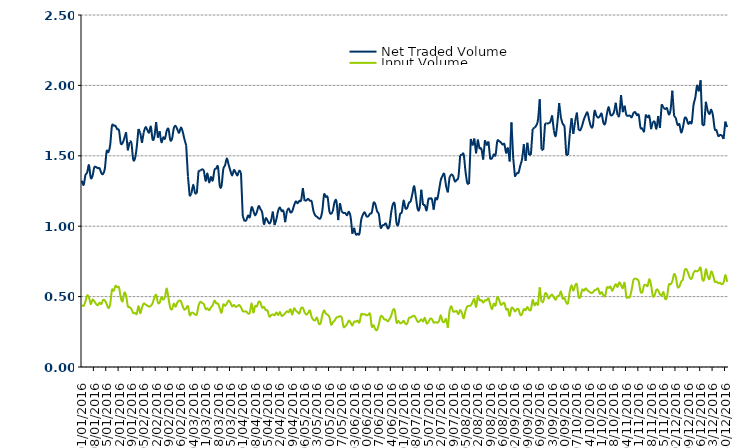
| Category | Net Traded Volume | Input Volume |
|---|---|---|
| 01/01/2016 | 1.323 | 0.439 |
| 02/01/2016 | 1.293 | 0.434 |
| 03/01/2016 | 1.362 | 0.464 |
| 04/01/2016 | 1.381 | 0.508 |
| 05/01/2016 | 1.434 | 0.495 |
| 06/01/2016 | 1.344 | 0.447 |
| 07/01/2016 | 1.357 | 0.478 |
| 08/01/2016 | 1.417 | 0.467 |
| 09/01/2016 | 1.42 | 0.449 |
| 10/01/2016 | 1.412 | 0.438 |
| 11/01/2016 | 1.411 | 0.457 |
| 12/01/2016 | 1.378 | 0.447 |
| 13/01/2016 | 1.371 | 0.476 |
| 14/01/2016 | 1.41 | 0.472 |
| 15/01/2016 | 1.531 | 0.449 |
| 16/01/2016 | 1.526 | 0.418 |
| 17/01/2016 | 1.576 | 0.447 |
| 18/01/2016 | 1.712 | 0.546 |
| 19/01/2016 | 1.714 | 0.541 |
| 20/01/2016 | 1.712 | 0.576 |
| 21/01/2016 | 1.689 | 0.566 |
| 22/01/2016 | 1.68 | 0.565 |
| 23/01/2016 | 1.589 | 0.493 |
| 24/01/2016 | 1.59 | 0.466 |
| 25/01/2016 | 1.624 | 0.528 |
| 26/01/2016 | 1.668 | 0.506 |
| 27/01/2016 | 1.539 | 0.432 |
| 28/01/2016 | 1.598 | 0.425 |
| 29/01/2016 | 1.593 | 0.411 |
| 30/01/2016 | 1.477 | 0.384 |
| 31/01/2016 | 1.479 | 0.384 |
| 01/02/2016 | 1.559 | 0.377 |
| 02/02/2016 | 1.691 | 0.433 |
| 03/02/2016 | 1.664 | 0.382 |
| 04/02/2016 | 1.592 | 0.423 |
| 05/02/2016 | 1.667 | 0.451 |
| 06/02/2016 | 1.703 | 0.444 |
| 07/02/2016 | 1.684 | 0.436 |
| 08/02/2016 | 1.664 | 0.429 |
| 09/02/2016 | 1.707 | 0.435 |
| 10/02/2016 | 1.616 | 0.453 |
| 11/02/2016 | 1.636 | 0.493 |
| 12/02/2016 | 1.739 | 0.512 |
| 13/02/2016 | 1.629 | 0.458 |
| 14/02/2016 | 1.674 | 0.457 |
| 15/02/2016 | 1.597 | 0.496 |
| 16/02/2016 | 1.631 | 0.478 |
| 17/02/2016 | 1.621 | 0.497 |
| 18/02/2016 | 1.678 | 0.558 |
| 19/02/2016 | 1.69 | 0.487 |
| 20/02/2016 | 1.613 | 0.421 |
| 21/02/2016 | 1.621 | 0.411 |
| 22/02/2016 | 1.695 | 0.45 |
| 23/02/2016 | 1.713 | 0.428 |
| 24/02/2016 | 1.688 | 0.458 |
| 25/02/2016 | 1.663 | 0.471 |
| 26/02/2016 | 1.701 | 0.467 |
| 27/02/2016 | 1.673 | 0.432 |
| 28/02/2016 | 1.618 | 0.407 |
| 29/02/2016 | 1.575 | 0.417 |
| 01/03/2016 | 1.353 | 0.432 |
| 02/03/2016 | 1.213 | 0.368 |
| 03/03/2016 | 1.233 | 0.386 |
| 04/03/2016 | 1.295 | 0.383 |
| 05/03/2016 | 1.236 | 0.374 |
| 06/03/2016 | 1.233 | 0.373 |
| 07/03/2016 | 1.394 | 0.436 |
| 08/03/2016 | 1.394 | 0.463 |
| 09/03/2016 | 1.404 | 0.455 |
| 10/03/2016 | 1.392 | 0.447 |
| 11/03/2016 | 1.322 | 0.411 |
| 12/03/2016 | 1.374 | 0.417 |
| 13/03/2016 | 1.311 | 0.402 |
| 14/03/2016 | 1.35 | 0.423 |
| 15/03/2016 | 1.324 | 0.439 |
| 16/03/2016 | 1.399 | 0.471 |
| 17/03/2016 | 1.411 | 0.453 |
| 18/03/2016 | 1.421 | 0.45 |
| 19/03/2016 | 1.287 | 0.418 |
| 20/03/2016 | 1.287 | 0.386 |
| 21/03/2016 | 1.406 | 0.444 |
| 22/03/2016 | 1.432 | 0.435 |
| 23/03/2016 | 1.481 | 0.45 |
| 24/03/2016 | 1.438 | 0.472 |
| 25/03/2016 | 1.395 | 0.457 |
| 26/03/2016 | 1.36 | 0.431 |
| 27/03/2016 | 1.399 | 0.441 |
| 28/03/2016 | 1.38 | 0.427 |
| 29/03/2016 | 1.361 | 0.432 |
| 30/03/2016 | 1.394 | 0.44 |
| 31/03/2016 | 1.38 | 0.424 |
| 01/04/2016 | 1.073 | 0.397 |
| 02/04/2016 | 1.035 | 0.394 |
| 03/04/2016 | 1.043 | 0.394 |
| 04/04/2016 | 1.076 | 0.38 |
| 05/04/2016 | 1.064 | 0.386 |
| 06/04/2016 | 1.135 | 0.454 |
| 07/04/2016 | 1.109 | 0.386 |
| 08/04/2016 | 1.077 | 0.432 |
| 09/04/2016 | 1.102 | 0.431 |
| 10/04/2016 | 1.143 | 0.463 |
| 11/04/2016 | 1.122 | 0.457 |
| 12/04/2016 | 1.097 | 0.421 |
| 13/04/2016 | 1.015 | 0.427 |
| 14/04/2016 | 1.057 | 0.404 |
| 15/04/2016 | 1.041 | 0.402 |
| 16/04/2016 | 1.019 | 0.359 |
| 17/04/2016 | 1.04 | 0.367 |
| 18/04/2016 | 1.104 | 0.374 |
| 19/04/2016 | 1.008 | 0.367 |
| 20/04/2016 | 1.048 | 0.388 |
| 21/04/2016 | 1.109 | 0.369 |
| 22/04/2016 | 1.133 | 0.391 |
| 23/04/2016 | 1.107 | 0.363 |
| 24/04/2016 | 1.109 | 0.369 |
| 25/04/2016 | 1.028 | 0.382 |
| 26/04/2016 | 1.109 | 0.396 |
| 27/04/2016 | 1.126 | 0.39 |
| 28/04/2016 | 1.098 | 0.411 |
| 29/04/2016 | 1.107 | 0.372 |
| 30/04/2016 | 1.146 | 0.416 |
| 01/05/2016 | 1.176 | 0.401 |
| 02/05/2016 | 1.163 | 0.39 |
| 03/05/2016 | 1.18 | 0.381 |
| 04/05/2016 | 1.184 | 0.417 |
| 05/05/2016 | 1.271 | 0.42 |
| 06/05/2016 | 1.18 | 0.389 |
| 07/05/2016 | 1.183 | 0.372 |
| 08/05/2016 | 1.194 | 0.383 |
| 09/05/2016 | 1.181 | 0.401 |
| 10/05/2016 | 1.175 | 0.354 |
| 11/05/2016 | 1.107 | 0.335 |
| 12/05/2016 | 1.077 | 0.332 |
| 13/05/2016 | 1.067 | 0.351 |
| 14/05/2016 | 1.056 | 0.308 |
| 15/05/2016 | 1.058 | 0.311 |
| 16/05/2016 | 1.109 | 0.368 |
| 17/05/2016 | 1.224 | 0.402 |
| 18/05/2016 | 1.208 | 0.379 |
| 19/05/2016 | 1.206 | 0.371 |
| 20/05/2016 | 1.107 | 0.355 |
| 21/05/2016 | 1.088 | 0.301 |
| 22/05/2016 | 1.112 | 0.318 |
| 23/05/2016 | 1.173 | 0.331 |
| 24/05/2016 | 1.176 | 0.351 |
| 25/05/2016 | 1.043 | 0.356 |
| 26/05/2016 | 1.163 | 0.36 |
| 27/05/2016 | 1.102 | 0.352 |
| 28/05/2016 | 1.094 | 0.286 |
| 29/05/2016 | 1.094 | 0.29 |
| 30/05/2016 | 1.077 | 0.304 |
| 31/05/2016 | 1.102 | 0.33 |
| 01/06/2016 | 1.066 | 0.315 |
| 02/06/2016 | 0.947 | 0.295 |
| 03/06/2016 | 0.988 | 0.322 |
| 04/06/2016 | 0.941 | 0.322 |
| 05/06/2016 | 0.946 | 0.329 |
| 06/06/2016 | 0.946 | 0.316 |
| 07/06/2016 | 1.044 | 0.374 |
| 08/06/2016 | 1.083 | 0.373 |
| 09/06/2016 | 1.099 | 0.375 |
| 10/06/2016 | 1.07 | 0.367 |
| 11/06/2016 | 1.071 | 0.371 |
| 12/06/2016 | 1.088 | 0.377 |
| 13/06/2016 | 1.097 | 0.288 |
| 14/06/2016 | 1.166 | 0.296 |
| 15/06/2016 | 1.155 | 0.269 |
| 16/06/2016 | 1.106 | 0.263 |
| 17/06/2016 | 1.084 | 0.304 |
| 18/06/2016 | 0.991 | 0.359 |
| 19/06/2016 | 1.005 | 0.358 |
| 20/06/2016 | 1.01 | 0.338 |
| 21/06/2016 | 1.019 | 0.337 |
| 22/06/2016 | 0.985 | 0.324 |
| 23/06/2016 | 1.005 | 0.34 |
| 24/06/2016 | 1.099 | 0.366 |
| 25/06/2016 | 1.158 | 0.405 |
| 26/06/2016 | 1.154 | 0.403 |
| 27/06/2016 | 1.022 | 0.316 |
| 28/06/2016 | 1.013 | 0.328 |
| 29/06/2016 | 1.086 | 0.311 |
| 30/06/2016 | 1.1 | 0.315 |
| 01/07/2016 | 1.182 | 0.328 |
| 02/07/2016 | 1.128 | 0.307 |
| 03/07/2016 | 1.13 | 0.309 |
| 04/07/2016 | 1.167 | 0.348 |
| 05/07/2016 | 1.177 | 0.352 |
| 06/07/2016 | 1.233 | 0.36 |
| 07/07/2016 | 1.284 | 0.364 |
| 08/07/2016 | 1.201 | 0.346 |
| 09/07/2016 | 1.12 | 0.321 |
| 10/07/2016 | 1.127 | 0.325 |
| 11/07/2016 | 1.259 | 0.339 |
| 12/07/2016 | 1.151 | 0.323 |
| 13/07/2016 | 1.149 | 0.349 |
| 14/07/2016 | 1.113 | 0.311 |
| 15/07/2016 | 1.19 | 0.318 |
| 16/07/2016 | 1.195 | 0.342 |
| 17/07/2016 | 1.192 | 0.34 |
| 18/07/2016 | 1.118 | 0.316 |
| 19/07/2016 | 1.205 | 0.319 |
| 20/07/2016 | 1.192 | 0.314 |
| 21/07/2016 | 1.254 | 0.326 |
| 22/07/2016 | 1.326 | 0.367 |
| 23/07/2016 | 1.357 | 0.324 |
| 24/07/2016 | 1.37 | 0.319 |
| 25/07/2016 | 1.287 | 0.34 |
| 26/07/2016 | 1.24 | 0.279 |
| 27/07/2016 | 1.348 | 0.405 |
| 28/07/2016 | 1.367 | 0.431 |
| 29/07/2016 | 1.357 | 0.395 |
| 30/07/2016 | 1.319 | 0.394 |
| 31/07/2016 | 1.329 | 0.398 |
| 01/08/2016 | 1.351 | 0.374 |
| 02/08/2016 | 1.504 | 0.405 |
| 03/08/2016 | 1.509 | 0.381 |
| 04/08/2016 | 1.508 | 0.346 |
| 05/08/2016 | 1.389 | 0.4 |
| 06/08/2016 | 1.308 | 0.43 |
| 07/08/2016 | 1.3 | 0.434 |
| 08/08/2016 | 1.62 | 0.437 |
| 09/08/2016 | 1.573 | 0.46 |
| 10/08/2016 | 1.623 | 0.483 |
| 11/08/2016 | 1.518 | 0.427 |
| 12/08/2016 | 1.615 | 0.504 |
| 13/08/2016 | 1.548 | 0.474 |
| 14/08/2016 | 1.549 | 0.475 |
| 15/08/2016 | 1.473 | 0.457 |
| 16/08/2016 | 1.611 | 0.474 |
| 17/08/2016 | 1.574 | 0.473 |
| 18/08/2016 | 1.602 | 0.488 |
| 19/08/2016 | 1.475 | 0.445 |
| 20/08/2016 | 1.483 | 0.41 |
| 21/08/2016 | 1.509 | 0.45 |
| 22/08/2016 | 1.506 | 0.436 |
| 23/08/2016 | 1.605 | 0.497 |
| 24/08/2016 | 1.604 | 0.478 |
| 25/08/2016 | 1.595 | 0.442 |
| 26/08/2016 | 1.58 | 0.449 |
| 27/08/2016 | 1.583 | 0.454 |
| 28/08/2016 | 1.521 | 0.409 |
| 29/08/2016 | 1.553 | 0.41 |
| 30/08/2016 | 1.46 | 0.362 |
| 31/08/2016 | 1.738 | 0.419 |
| 01/09/2016 | 1.483 | 0.414 |
| 02/09/2016 | 1.352 | 0.394 |
| 03/09/2016 | 1.379 | 0.41 |
| 04/09/2016 | 1.38 | 0.41 |
| 05/09/2016 | 1.431 | 0.37 |
| 06/09/2016 | 1.476 | 0.377 |
| 07/09/2016 | 1.582 | 0.411 |
| 08/09/2016 | 1.464 | 0.403 |
| 09/09/2016 | 1.592 | 0.427 |
| 10/09/2016 | 1.506 | 0.406 |
| 11/09/2016 | 1.508 | 0.408 |
| 12/09/2016 | 1.69 | 0.476 |
| 13/09/2016 | 1.7 | 0.438 |
| 14/09/2016 | 1.714 | 0.457 |
| 15/09/2016 | 1.754 | 0.437 |
| 16/09/2016 | 1.902 | 0.566 |
| 17/09/2016 | 1.544 | 0.461 |
| 18/09/2016 | 1.541 | 0.464 |
| 19/09/2016 | 1.729 | 0.522 |
| 20/09/2016 | 1.729 | 0.517 |
| 21/09/2016 | 1.731 | 0.487 |
| 22/09/2016 | 1.741 | 0.504 |
| 23/09/2016 | 1.787 | 0.514 |
| 24/09/2016 | 1.68 | 0.494 |
| 25/09/2016 | 1.64 | 0.478 |
| 26/09/2016 | 1.737 | 0.502 |
| 27/09/2016 | 1.874 | 0.507 |
| 28/09/2016 | 1.769 | 0.536 |
| 29/09/2016 | 1.728 | 0.486 |
| 30/09/2016 | 1.713 | 0.491 |
| 01/10/2016 | 1.506 | 0.457 |
| 02/10/2016 | 1.506 | 0.455 |
| 03/10/2016 | 1.657 | 0.538 |
| 04/10/2016 | 1.766 | 0.581 |
| 05/10/2016 | 1.656 | 0.541 |
| 06/10/2016 | 1.742 | 0.577 |
| 07/10/2016 | 1.807 | 0.587 |
| 08/10/2016 | 1.684 | 0.498 |
| 09/10/2016 | 1.683 | 0.498 |
| 10/10/2016 | 1.715 | 0.549 |
| 11/10/2016 | 1.759 | 0.541 |
| 12/10/2016 | 1.789 | 0.559 |
| 13/10/2016 | 1.808 | 0.544 |
| 14/10/2016 | 1.752 | 0.535 |
| 15/10/2016 | 1.708 | 0.526 |
| 16/10/2016 | 1.71 | 0.529 |
| 17/10/2016 | 1.818 | 0.545 |
| 18/10/2016 | 1.786 | 0.55 |
| 19/10/2016 | 1.771 | 0.557 |
| 20/10/2016 | 1.781 | 0.519 |
| 21/10/2016 | 1.799 | 0.532 |
| 22/10/2016 | 1.736 | 0.511 |
| 23/10/2016 | 1.728 | 0.505 |
| 24/10/2016 | 1.797 | 0.564 |
| 25/10/2016 | 1.846 | 0.562 |
| 26/10/2016 | 1.792 | 0.571 |
| 27/10/2016 | 1.79 | 0.54 |
| 28/10/2016 | 1.811 | 0.567 |
| 29/10/2016 | 1.877 | 0.589 |
| 30/10/2016 | 1.788 | 0.568 |
| 31/10/2016 | 1.79 | 0.601 |
| 01/11/2016 | 1.932 | 0.581 |
| 02/11/2016 | 1.81 | 0.56 |
| 03/11/2016 | 1.856 | 0.597 |
| 04/11/2016 | 1.791 | 0.498 |
| 05/11/2016 | 1.785 | 0.497 |
| 06/11/2016 | 1.785 | 0.498 |
| 07/11/2016 | 1.773 | 0.55 |
| 08/11/2016 | 1.803 | 0.617 |
| 09/11/2016 | 1.81 | 0.628 |
| 10/11/2016 | 1.788 | 0.623 |
| 11/11/2016 | 1.79 | 0.609 |
| 12/11/2016 | 1.7 | 0.537 |
| 13/11/2016 | 1.694 | 0.531 |
| 14/11/2016 | 1.667 | 0.579 |
| 15/11/2016 | 1.793 | 0.583 |
| 16/11/2016 | 1.769 | 0.575 |
| 17/11/2016 | 1.782 | 0.624 |
| 18/11/2016 | 1.689 | 0.581 |
| 19/11/2016 | 1.742 | 0.503 |
| 20/11/2016 | 1.74 | 0.511 |
| 21/11/2016 | 1.693 | 0.549 |
| 22/11/2016 | 1.783 | 0.543 |
| 23/11/2016 | 1.698 | 0.517 |
| 24/11/2016 | 1.866 | 0.508 |
| 25/11/2016 | 1.841 | 0.532 |
| 26/11/2016 | 1.832 | 0.482 |
| 27/11/2016 | 1.838 | 0.499 |
| 28/11/2016 | 1.794 | 0.583 |
| 29/11/2016 | 1.826 | 0.587 |
| 30/11/2016 | 1.963 | 0.608 |
| 01/12/2016 | 1.784 | 0.66 |
| 02/12/2016 | 1.768 | 0.637 |
| 03/12/2016 | 1.719 | 0.569 |
| 04/12/2016 | 1.724 | 0.572 |
| 05/12/2016 | 1.666 | 0.606 |
| 06/12/2016 | 1.701 | 0.622 |
| 07/12/2016 | 1.767 | 0.688 |
| 08/12/2016 | 1.764 | 0.694 |
| 09/12/2016 | 1.727 | 0.665 |
| 10/12/2016 | 1.741 | 0.632 |
| 11/12/2016 | 1.737 | 0.629 |
| 12/12/2016 | 1.86 | 0.668 |
| 13/12/2016 | 1.913 | 0.683 |
| 14/12/2016 | 1.998 | 0.679 |
| 15/12/2016 | 1.962 | 0.689 |
| 16/12/2016 | 2.036 | 0.705 |
| 17/12/2016 | 1.719 | 0.623 |
| 18/12/2016 | 1.716 | 0.621 |
| 19/12/2016 | 1.883 | 0.694 |
| 20/12/2016 | 1.819 | 0.645 |
| 21/12/2016 | 1.796 | 0.625 |
| 22/12/2016 | 1.827 | 0.677 |
| 23/12/2016 | 1.784 | 0.654 |
| 24/12/2016 | 1.69 | 0.606 |
| 25/12/2016 | 1.681 | 0.606 |
| 26/12/2016 | 1.641 | 0.595 |
| 27/12/2016 | 1.648 | 0.598 |
| 28/12/2016 | 1.644 | 0.587 |
| 29/12/2016 | 1.62 | 0.6 |
| 30/12/2016 | 1.743 | 0.653 |
| 31/12/2016 | 1.704 | 0.605 |